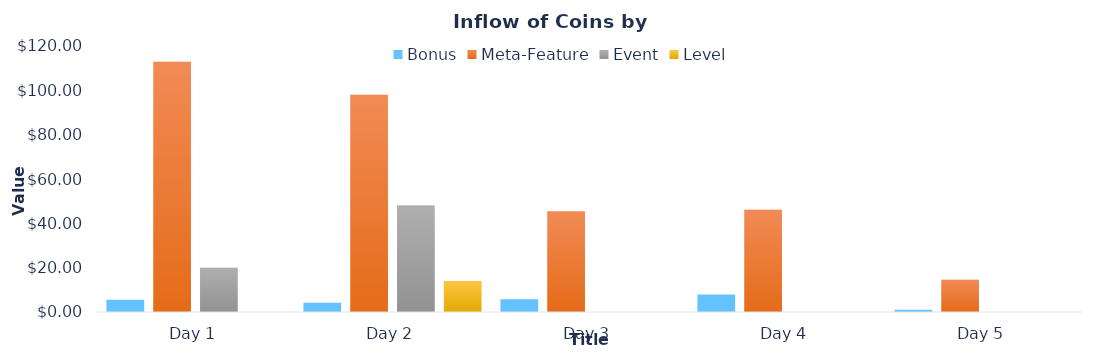
| Category | Bonus | Meta-Feature | Event | Level |
|---|---|---|---|---|
| Day 1 | 5.48 | 112.904 | 20 | 0 |
| Day 2 | 4.14 | 97.958 | 48 | 14 |
| Day 3 | 5.7 | 45.484 | 0 | 0 |
| Day 4 | 7.9 | 46.152 | 0 | 0 |
| Day 5 | 1 | 14.604 | 0 | 0 |